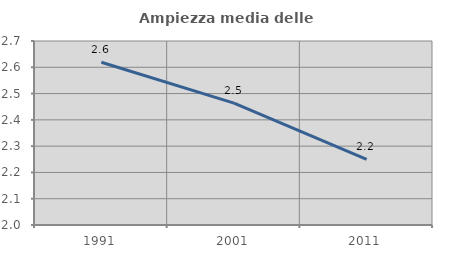
| Category | Ampiezza media delle famiglie |
|---|---|
| 1991.0 | 2.619 |
| 2001.0 | 2.464 |
| 2011.0 | 2.25 |